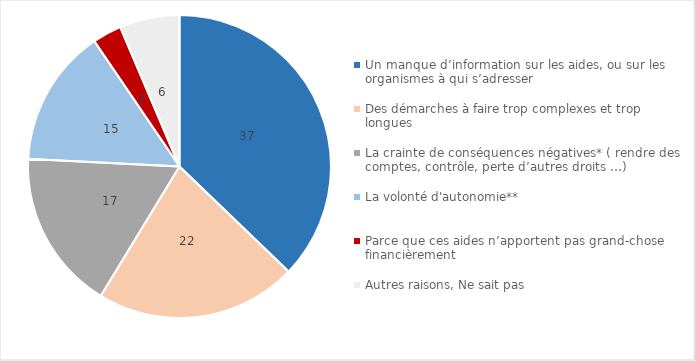
| Category | 2021 |
|---|---|
| Un manque d’information sur les aides, ou sur les organismes à qui s’adresser | 37.2 |
| Des démarches à faire trop complexes et trop longues | 21.5 |
| La crainte de conséquences négatives* ( rendre des comptes, contrôle, perte d’autres droits …) | 17.1 |
| La volonté d'autonomie** | 14.7 |
| Parce que ces aides n’apportent pas grand-chose financièrement | 3.1 |
| Autres raisons, Ne sait pas  | 6.4 |